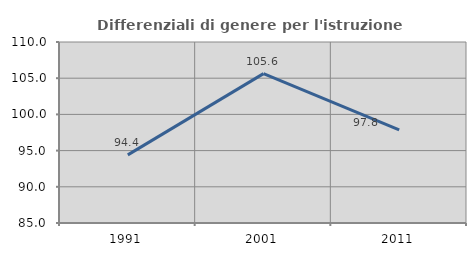
| Category | Differenziali di genere per l'istruzione superiore |
|---|---|
| 1991.0 | 94.408 |
| 2001.0 | 105.634 |
| 2011.0 | 97.849 |